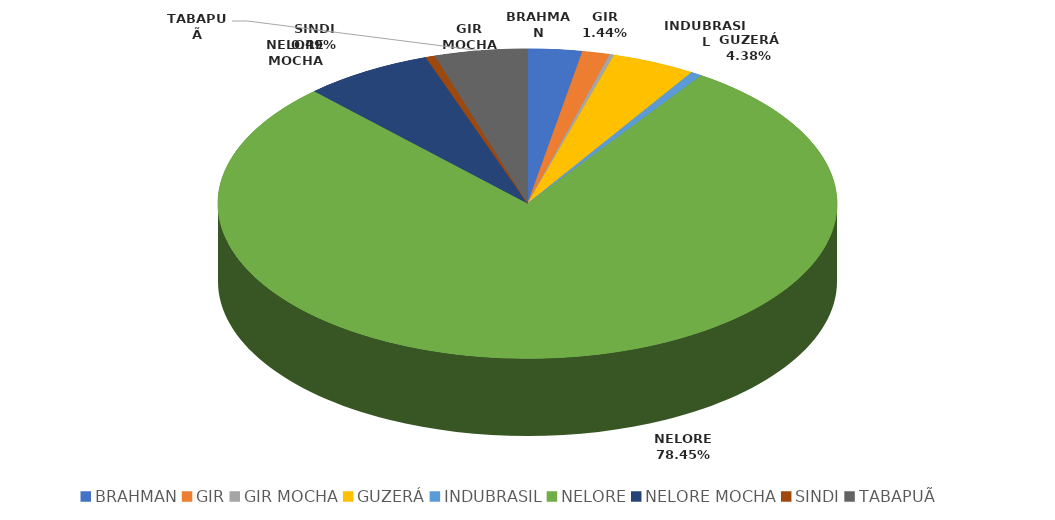
| Category | Series 0 |
|---|---|
| BRAHMAN | 727142 |
| GIR | 368837 |
| GIR MOCHA | 60132 |
| GUZERÁ | 1124139 |
| INDUBRASIL | 152462 |
| NELORE | 20157140 |
| NELORE MOCHA | 1734529 |
| SINDI | 125345 |
| TABAPUÃ | 1244471 |